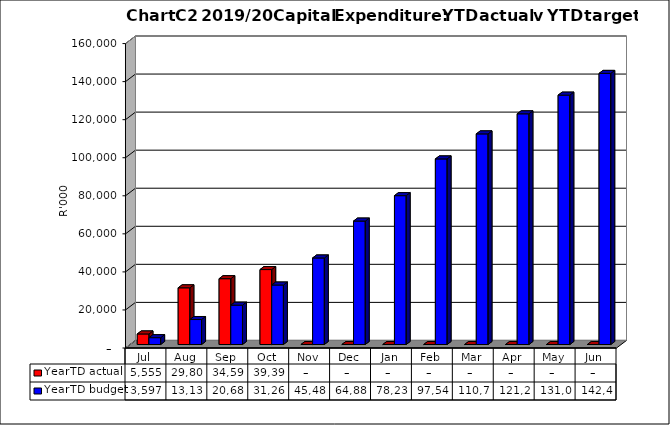
| Category | YearTD actual | YearTD budget |
|---|---|---|
| Jul | 5554740.23 | 3597000 |
| Aug | 29801091.39 | 13137000 |
| Sep | 34591330.1 | 20682000 |
| Oct | 39395801.57 | 31265000 |
| Nov | 0 | 45485000 |
| Dec | 0 | 64881000 |
| Jan | 0 | 78237000 |
| Feb | 0 | 97546000 |
| Mar | 0 | 110701000 |
| Apr | 0 | 121248000 |
| May | 0 | 131069000 |
| Jun | 0 | 142486000 |